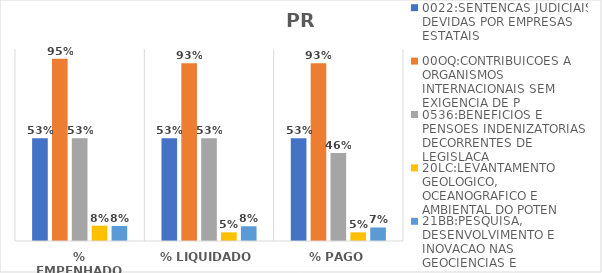
| Category | 0022:SENTENCAS JUDICIAIS DEVIDAS POR EMPRESAS ESTATAIS | 00OQ:CONTRIBUICOES A ORGANISMOS INTERNACIONAIS SEM EXIGENCIA DE P | 0536:BENEFICIOS E PENSOES INDENIZATORIAS DECORRENTES DE LEGISLACA | 20LC:LEVANTAMENTO GEOLOGICO, OCEANOGRAFICO E AMBIENTAL DO POTEN | 21BB:PESQUISA, DESENVOLVIMENTO E INOVACAO NAS GEOCIENCIAS E |
|---|---|---|---|---|---|
| % EMPENHADO | 0.535 | 0.95 | 0.535 | 0.08 | 0.078 |
| % LIQUIDADO | 0.535 | 0.926 | 0.535 | 0.045 | 0.077 |
| % PAGO | 0.535 | 0.926 | 0.459 | 0.045 | 0.07 |